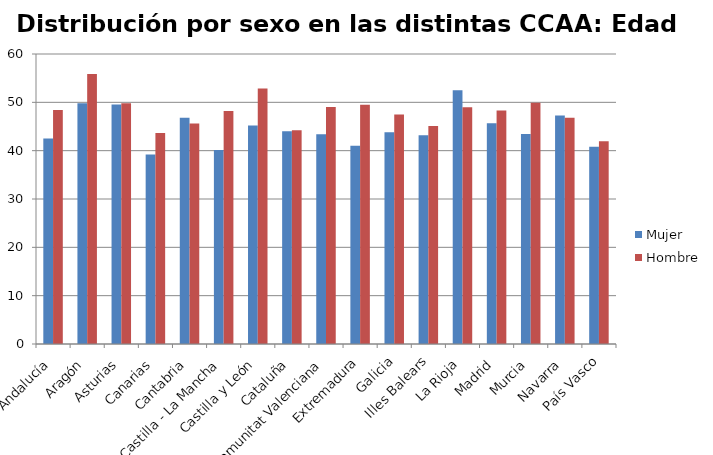
| Category | Mujer | Hombre |
|---|---|---|
| Andalucía | 42.53 | 48.43 |
| Aragón | 49.79 | 55.87 |
| Asturias | 49.53 | 49.81 |
| Canarias | 39.21 | 43.65 |
| Cantabria | 46.83 | 45.6 |
| Castilla - La Mancha | 40.13 | 48.23 |
| Castilla y León | 45.23 | 52.86 |
| Cataluña | 44.03 | 44.22 |
| Comunitat Valenciana | 43.41 | 49.04 |
| Extremadura | 41.03 | 49.48 |
| Galicia | 43.83 | 47.48 |
| Illes Balears | 43.17 | 45.08 |
| La Rioja | 52.5 | 49 |
| Madrid | 45.68 | 48.3 |
| Murcia | 43.47 | 49.92 |
| Navarra | 47.27 | 46.83 |
| País Vasco | 40.81 | 41.95 |